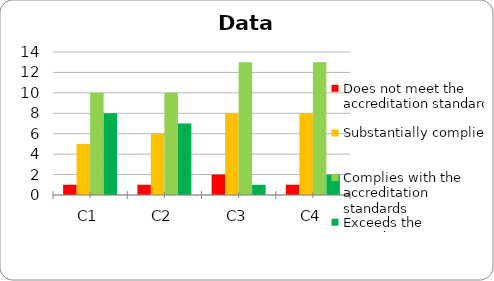
| Category | Does not meet the accreditation standard | Substantially complies | Complies with the accreditation standards | Exceeds the accreditation standards |
|---|---|---|---|---|
| C1 | 1 | 5 | 10 | 8 |
| C2 | 1 | 6 | 10 | 7 |
| C3 | 2 | 8 | 13 | 1 |
| C4 | 1 | 8 | 13 | 2 |